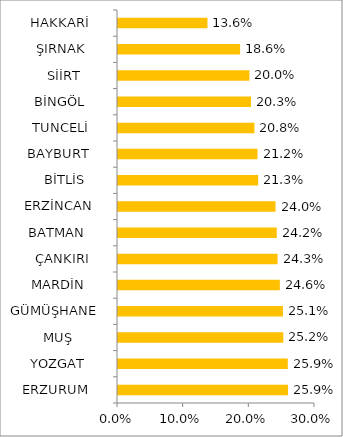
| Category | Series 0 |
|---|---|
| ERZURUM    | 0.259 |
| YOZGAT     | 0.259 |
| MUŞ        | 0.252 |
| GÜMÜŞHANE  | 0.251 |
| MARDİN     | 0.246 |
| ÇANKIRI    | 0.243 |
| BATMAN     | 0.242 |
| ERZİNCAN   | 0.24 |
| BİTLİS     | 0.213 |
| BAYBURT    | 0.212 |
| TUNCELİ    | 0.208 |
| BİNGÖL     | 0.203 |
| SİİRT      | 0.2 |
| ŞIRNAK     | 0.186 |
| HAKKARİ    | 0.136 |